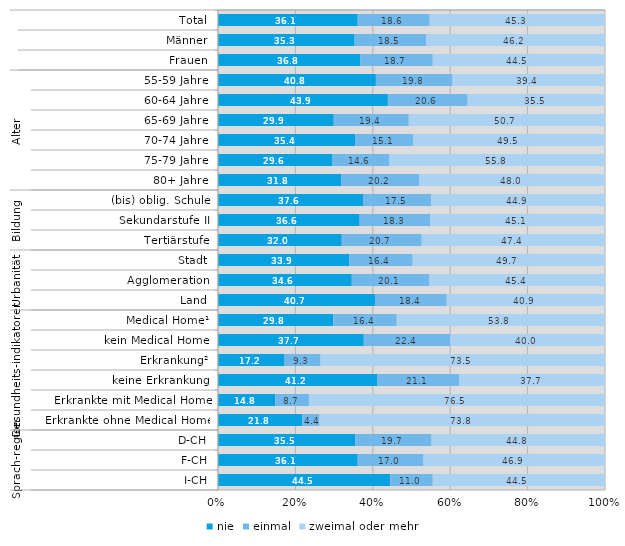
| Category | nie | einmal | zweimal oder mehr |
|---|---|---|---|
| 0 | 36.1 | 18.6 | 45.3 |
| 1 | 35.3 | 18.5 | 46.2 |
| 2 | 36.8 | 18.7 | 44.5 |
| 3 | 40.8 | 19.8 | 39.4 |
| 4 | 43.9 | 20.6 | 35.5 |
| 5 | 29.9 | 19.4 | 50.7 |
| 6 | 35.4 | 15.1 | 49.5 |
| 7 | 29.6 | 14.6 | 55.8 |
| 8 | 31.8 | 20.2 | 48 |
| 9 | 37.6 | 17.5 | 44.9 |
| 10 | 36.6 | 18.3 | 45.1 |
| 11 | 32 | 20.7 | 47.4 |
| 12 | 33.9 | 16.4 | 49.7 |
| 13 | 34.6 | 20.1 | 45.4 |
| 14 | 40.7 | 18.4 | 40.9 |
| 15 | 29.8 | 16.4 | 53.8 |
| 16 | 37.7 | 22.4 | 40 |
| 17 | 17.2 | 9.3 | 73.5 |
| 18 | 41.2 | 21.1 | 37.7 |
| 19 | 14.8 | 8.7 | 76.5 |
| 20 | 21.8 | 4.4 | 73.8 |
| 21 | 35.5 | 19.7 | 44.8 |
| 22 | 36.1 | 17 | 46.9 |
| 23 | 44.5 | 11 | 44.5 |